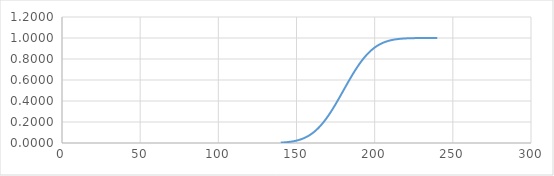
| Category | Series 0 |
|---|---|
| 140.0 | 0.004 |
| 141.0 | 0.005 |
| 142.0 | 0.006 |
| 143.0 | 0.007 |
| 144.0 | 0.008 |
| 145.0 | 0.01 |
| 146.0 | 0.012 |
| 147.0 | 0.014 |
| 148.0 | 0.016 |
| 149.0 | 0.019 |
| 150.0 | 0.023 |
| 151.0 | 0.027 |
| 152.0 | 0.031 |
| 153.0 | 0.036 |
| 154.0 | 0.042 |
| 155.0 | 0.048 |
| 156.0 | 0.055 |
| 157.0 | 0.063 |
| 158.0 | 0.071 |
| 159.0 | 0.081 |
| 160.0 | 0.091 |
| 161.0 | 0.103 |
| 162.0 | 0.115 |
| 163.0 | 0.129 |
| 164.0 | 0.143 |
| 165.0 | 0.159 |
| 166.0 | 0.175 |
| 167.0 | 0.193 |
| 168.0 | 0.212 |
| 169.0 | 0.232 |
| 170.0 | 0.252 |
| 171.0 | 0.274 |
| 172.0 | 0.297 |
| 173.0 | 0.32 |
| 174.0 | 0.345 |
| 175.0 | 0.369 |
| 176.0 | 0.395 |
| 177.0 | 0.421 |
| 178.0 | 0.447 |
| 179.0 | 0.473 |
| 180.0 | 0.5 |
| 181.0 | 0.527 |
| 182.0 | 0.553 |
| 183.0 | 0.579 |
| 184.0 | 0.605 |
| 185.0 | 0.631 |
| 186.0 | 0.655 |
| 187.0 | 0.68 |
| 188.0 | 0.703 |
| 189.0 | 0.726 |
| 190.0 | 0.748 |
| 191.0 | 0.768 |
| 192.0 | 0.788 |
| 193.0 | 0.807 |
| 194.0 | 0.825 |
| 195.0 | 0.841 |
| 196.0 | 0.857 |
| 197.0 | 0.871 |
| 198.0 | 0.885 |
| 199.0 | 0.897 |
| 200.0 | 0.909 |
| 201.0 | 0.919 |
| 202.0 | 0.929 |
| 203.0 | 0.937 |
| 204.0 | 0.945 |
| 205.0 | 0.952 |
| 206.0 | 0.958 |
| 207.0 | 0.964 |
| 208.0 | 0.969 |
| 209.0 | 0.973 |
| 210.0 | 0.977 |
| 211.0 | 0.981 |
| 212.0 | 0.984 |
| 213.0 | 0.986 |
| 214.0 | 0.988 |
| 215.0 | 0.99 |
| 216.0 | 0.992 |
| 217.0 | 0.993 |
| 218.0 | 0.994 |
| 219.0 | 0.995 |
| 220.0 | 0.996 |
| 221.0 | 0.997 |
| 222.0 | 0.997 |
| 223.0 | 0.998 |
| 224.0 | 0.998 |
| 225.0 | 0.999 |
| 226.0 | 0.999 |
| 227.0 | 0.999 |
| 228.0 | 0.999 |
| 229.0 | 0.999 |
| 230.0 | 1 |
| 231.0 | 1 |
| 232.0 | 1 |
| 233.0 | 1 |
| 234.0 | 1 |
| 235.0 | 1 |
| 236.0 | 1 |
| 237.0 | 1 |
| 238.0 | 1 |
| 239.0 | 1 |
| 240.0 | 1 |